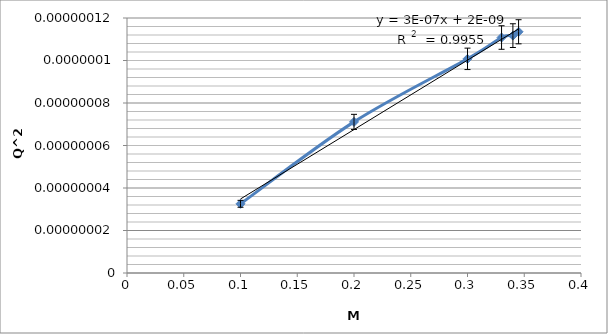
| Category | Series 0 |
|---|---|
| 0.1 | 0 |
| 0.2 | 0 |
| 0.3 | 0 |
| 0.33 | 0 |
| 0.34 | 0 |
| 0.345 | 0 |